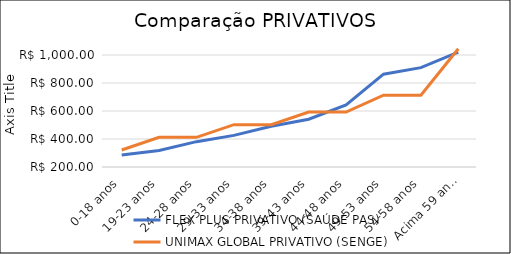
| Category | FLEX PLUS PRIVATIVO (SAÚDE PAS) | UNIMAX GLOBAL PRIVATIVO (SENGE) |
|---|---|---|
| 0-18 anos | 285.78 | 321.23 |
| 19-23 anos | 317.54 | 411.69 |
| 24-28 anos | 381.04 | 411.69 |
| 29-33 anos | 425.79 | 502.14 |
| 34-38 anos | 490.74 | 502.14 |
| 39-43 anos | 541.26 | 592.61 |
| 44-48 anos | 643.23 | 592.61 |
| 49-53 anos | 862.88 | 713.23 |
| 54-58 anos | 909.94 | 713.23 |
| Acima 59 anos | 1019.76 | 1044.96 |